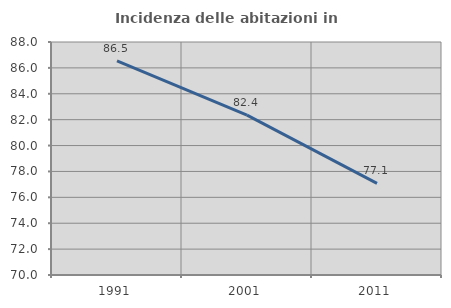
| Category | Incidenza delle abitazioni in proprietà  |
|---|---|
| 1991.0 | 86.538 |
| 2001.0 | 82.353 |
| 2011.0 | 77.083 |